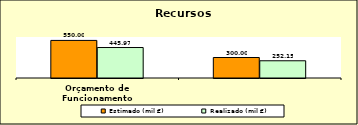
| Category | Estimado (mil €) | Realizado (mil €) |
|---|---|---|
| Orçamento de Funcionamento | 550 | 445.965 |